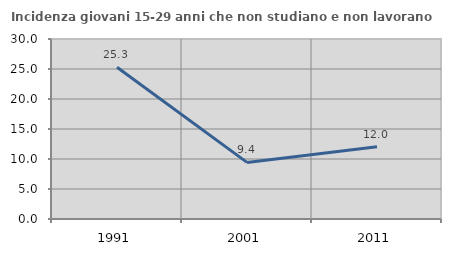
| Category | Incidenza giovani 15-29 anni che non studiano e non lavorano  |
|---|---|
| 1991.0 | 25.301 |
| 2001.0 | 9.434 |
| 2011.0 | 12.048 |